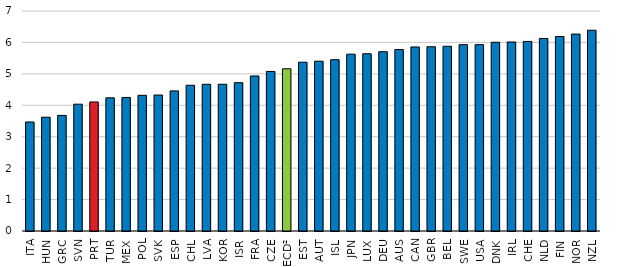
| Category | Prof. mgt. |
|---|---|
| ITA | 3.469 |
| HUN | 3.621 |
| GRC | 3.679 |
| SVN | 4.035 |
| PRT | 4.106 |
| TUR | 4.237 |
| MEX | 4.249 |
| POL | 4.318 |
| SVK | 4.326 |
| ESP | 4.458 |
| CHL | 4.637 |
| LVA | 4.668 |
| KOR | 4.669 |
| ISR | 4.72 |
| FRA | 4.933 |
| CZE | 5.077 |
| OECD² | 5.161 |
| EST | 5.37 |
| AUT | 5.403 |
| ISL | 5.449 |
| JPN | 5.626 |
| LUX | 5.639 |
| DEU | 5.705 |
| AUS | 5.775 |
| CAN | 5.856 |
| GBR | 5.862 |
| BEL | 5.878 |
| SWE | 5.928 |
| USA | 5.93 |
| DNK | 6.004 |
| IRL | 6.014 |
| CHE | 6.032 |
| NLD | 6.126 |
| FIN | 6.186 |
| NOR | 6.266 |
| NZL | 6.388 |